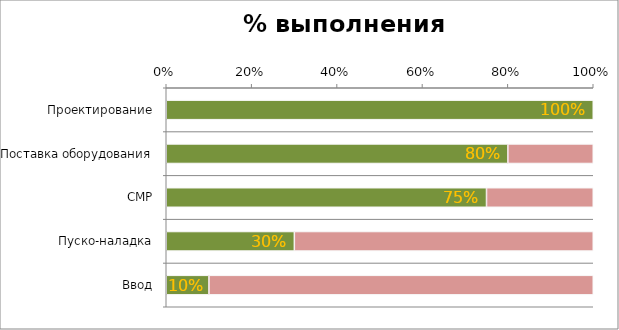
| Category | Выполнено, % | Служебный |
|---|---|---|
| Проектирование | 1 | 0 |
| Поставка оборудования | 0.8 | 0.2 |
| СМР | 0.75 | 0.25 |
| Пуско-наладка | 0.3 | 0.7 |
| Ввод | 0.1 | 0.9 |